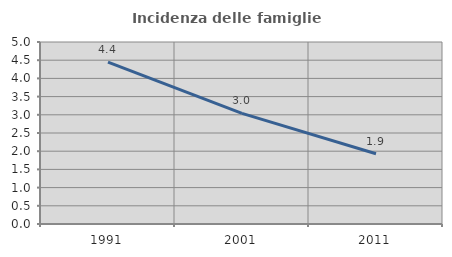
| Category | Incidenza delle famiglie numerose |
|---|---|
| 1991.0 | 4.45 |
| 2001.0 | 3.04 |
| 2011.0 | 1.929 |